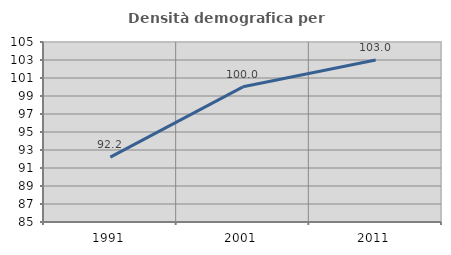
| Category | Densità demografica |
|---|---|
| 1991.0 | 92.203 |
| 2001.0 | 100.018 |
| 2011.0 | 103.007 |